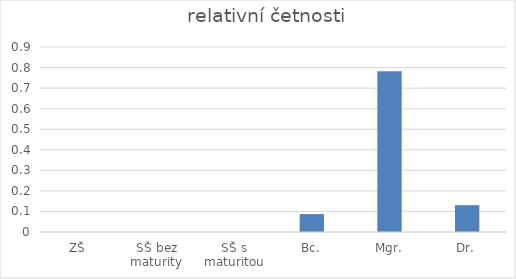
| Category | relativní četnosti |
|---|---|
| ZŠ | 0 |
| SŠ bez maturity | 0 |
| SŠ s maturitou | 0 |
| Bc. | 0.087 |
| Mgr. | 0.783 |
| Dr. | 0.13 |